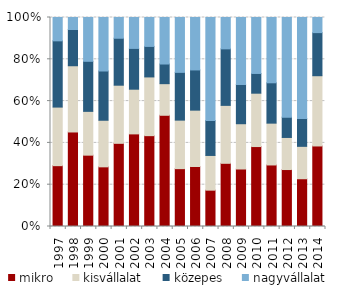
| Category | mikro | kisvállalat | közepes | nagyvállalat |
|---|---|---|---|---|
| 1997.0 | 135000000 | 130000000 | 147000000 | 51800000 |
| 1998.0 | 134000000 | 93900000 | 51400000 | 17000000 |
| 1999.0 | 171000000 | 105000000 | 120000000 | 105000000 |
| 2000.0 | 155000000 | 121000000 | 128000000 | 139000000 |
| 2001.0 | 186000000 | 130000000 | 105000000 | 46400000 |
| 2002.0 | 178000000 | 85900000 | 78400000 | 59400000 |
| 2003.0 | 181000000 | 117000000 | 60800000 | 57600000 |
| 2004.0 | 373000000 | 106000000 | 65900000 | 156000000 |
| 2005.0 | 155000000 | 130000000 | 128000000 | 147000000 |
| 2006.0 | 167000000 | 157000000 | 112000000 | 146000000 |
| 2007.0 | 176000000 | 168000000 | 169000000 | 499000000 |
| 2008.0 | 180000000 | 165000000 | 161000000 | 89300000 |
| 2009.0 | 127000000 | 100000000 | 86600000 | 148000000 |
| 2010.0 | 111000000 | 74100000 | 27400000 | 77700000 |
| 2011.0 | 99900000 | 67900000 | 65500000 | 106000000 |
| 2012.0 | 78300000 | 44100000 | 27900000 | 137000000 |
| 2013.0 | 82700000 | 56100000 | 48100000 | 175000000 |
| 2014.0 | 78300000 | 68300000 | 41900000 | 14700000 |